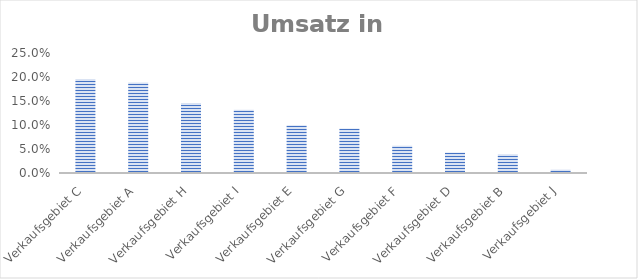
| Category | Umsatz in % |
|---|---|
| Verkaufsgebiet C | 0.196 |
| Verkaufsgebiet A | 0.189 |
| Verkaufsgebiet H | 0.146 |
| Verkaufsgebiet I | 0.132 |
| Verkaufsgebiet E | 0.1 |
| Verkaufsgebiet G | 0.093 |
| Verkaufsgebiet F | 0.057 |
| Verkaufsgebiet D | 0.043 |
| Verkaufsgebiet B | 0.039 |
| Verkaufsgebiet J | 0.007 |